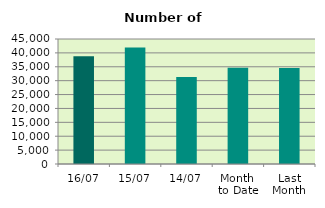
| Category | Series 0 |
|---|---|
| 16/07 | 38772 |
| 15/07 | 41968 |
| 14/07 | 31340 |
| Month 
to Date | 34683.333 |
| Last
Month | 34545 |